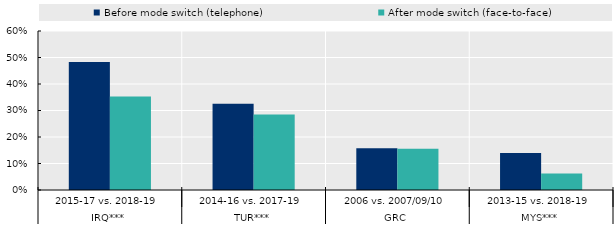
| Category | Before mode switch (telephone) | After mode switch (face-to-face) |
|---|---|---|
| 0 | 0.483 | 0.353 |
| 1 | 0.326 | 0.285 |
| 2 | 0.158 | 0.155 |
| 3 | 0.14 | 0.062 |